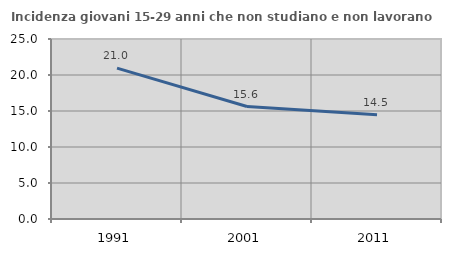
| Category | Incidenza giovani 15-29 anni che non studiano e non lavorano  |
|---|---|
| 1991.0 | 20.963 |
| 2001.0 | 15.625 |
| 2011.0 | 14.488 |